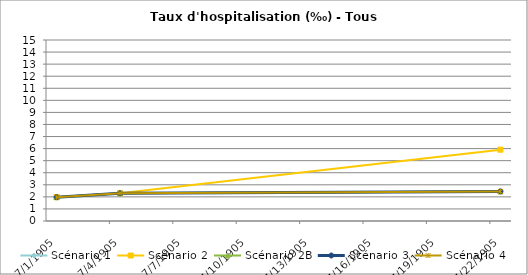
| Category | Scénario 1 | Scénario 2 | Scénario 2B | Scénario 3 | Scénario 4 |
|---|---|---|---|---|---|
| 2009.0 | 1.975 | 1.975 | 1.975 | 1.975 | 1.975 |
| 2012.0 | 2.302 | 2.302 | 2.302 | 2.302 | 2.302 |
| 2030.0 | 2.453 | 5.911 | 2.453 | 2.453 | 2.453 |